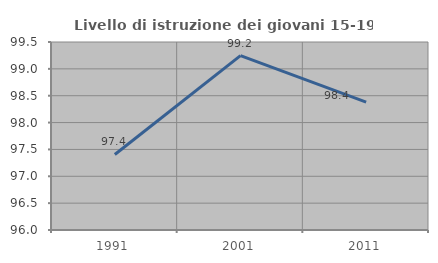
| Category | Livello di istruzione dei giovani 15-19 anni |
|---|---|
| 1991.0 | 97.406 |
| 2001.0 | 99.245 |
| 2011.0 | 98.381 |